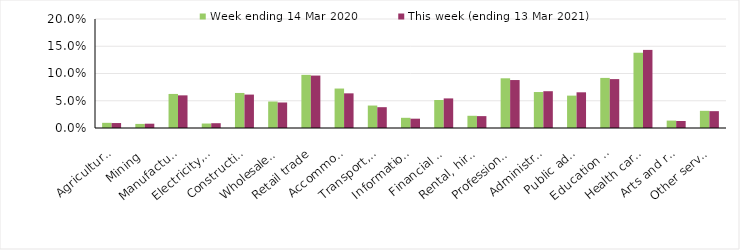
| Category | Week ending 14 Mar 2020 | This week (ending 13 Mar 2021) |
|---|---|---|
| Agriculture, forestry and fishing | 0.01 | 0.009 |
| Mining | 0.008 | 0.008 |
| Manufacturing | 0.062 | 0.06 |
| Electricity, gas, water and waste services | 0.008 | 0.009 |
| Construction | 0.064 | 0.061 |
| Wholesale trade | 0.049 | 0.047 |
| Retail trade | 0.098 | 0.096 |
| Accommodation and food services | 0.072 | 0.064 |
| Transport, postal and warehousing | 0.041 | 0.038 |
| Information media and telecommunications | 0.019 | 0.017 |
| Financial and insurance services | 0.051 | 0.054 |
| Rental, hiring and real estate services | 0.022 | 0.022 |
| Professional, scientific and technical services | 0.091 | 0.088 |
| Administrative and support services | 0.066 | 0.068 |
| Public administration and safety | 0.059 | 0.066 |
| Education and training | 0.092 | 0.09 |
| Health care and social assistance | 0.138 | 0.143 |
| Arts and recreation services | 0.014 | 0.013 |
| Other services | 0.032 | 0.031 |